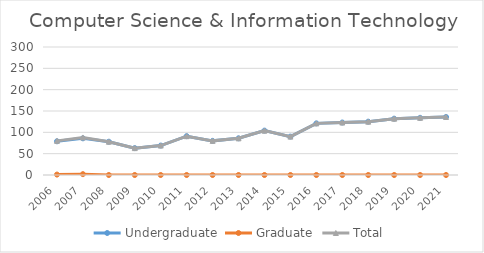
| Category | Undergraduate | Graduate | Total |
|---|---|---|---|
| 2006.0 | 79 | 1 | 80 |
| 2007.0 | 86 | 2 | 88 |
| 2008.0 | 78 | 0 | 78 |
| 2009.0 | 63 | 0 | 63 |
| 2010.0 | 69 | 0 | 69 |
| 2011.0 | 91 | 0 | 91 |
| 2012.0 | 80 | 0 | 80 |
| 2013.0 | 86 | 0 | 86 |
| 2014.0 | 104 | 0 | 104 |
| 2015.0 | 90 | 0 | 90 |
| 2016.0 | 121 | 0 | 121 |
| 2017.0 | 123 | 0 | 123 |
| 2018.0 | 125 | 0 | 125 |
| 2019.0 | 132 | 0 | 132 |
| 2020.0 | 134 | 0 | 134 |
| 2021.0 | 136 | 0 | 136 |